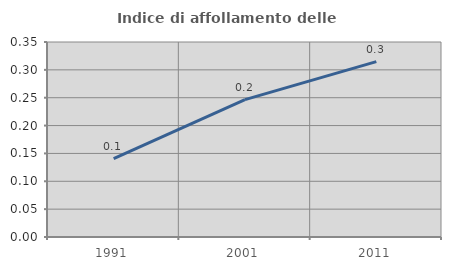
| Category | Indice di affollamento delle abitazioni  |
|---|---|
| 1991.0 | 0.141 |
| 2001.0 | 0.247 |
| 2011.0 | 0.315 |